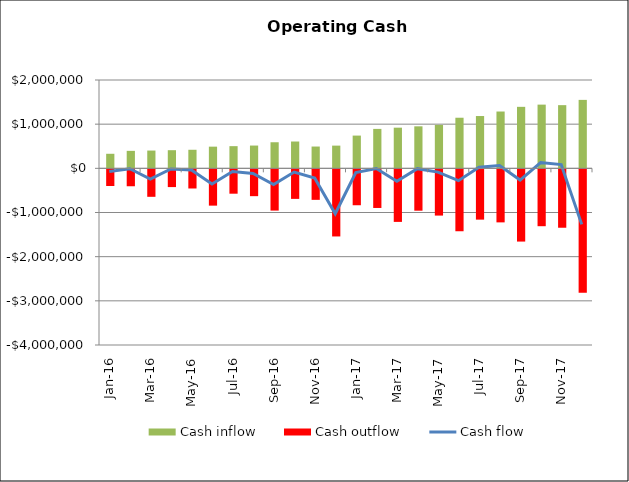
| Category | Cash inflow | Cash outflow |
|---|---|---|
| 2016-01-01 | 329550 | -400619.25 |
| 2016-02-01 | 395667.75 | -405765.146 |
| 2016-03-01 | 402654.259 | -644878.325 |
| 2016-04-01 | 410826.624 | -424651.594 |
| 2016-05-01 | 420202.111 | -456337.285 |
| 2016-06-01 | 490849.422 | -844694.672 |
| 2016-07-01 | 502323.265 | -574263.641 |
| 2016-08-01 | 515722.552 | -630092.544 |
| 2016-09-01 | 590659.028 | -956878.969 |
| 2016-10-01 | 607207.05 | -691732.952 |
| 2016-11-01 | 493494.797 | -713571.798 |
| 2016-12-01 | 514339.431 | -1542385.823 |
| 2017-01-01 | 741459.446 | -835807.025 |
| 2017-02-01 | 892940.775 | -897437.005 |
| 2017-03-01 | 920656.275 | -1212728.597 |
| 2017-04-01 | 950960.875 | -959119.718 |
| 2017-05-01 | 983728.896 | -1069843.401 |
| 2017-06-01 | 1145593.714 | -1424535.151 |
| 2017-07-01 | 1184271.178 | -1161466.609 |
| 2017-08-01 | 1286405.492 | -1223614.741 |
| 2017-09-01 | 1392377.118 | -1658280.911 |
| 2017-10-01 | 1442407.066 | -1310344.954 |
| 2017-11-01 | 1430552.814 | -1345014.63 |
| 2017-12-01 | 1549769.644 | -2818408.902 |